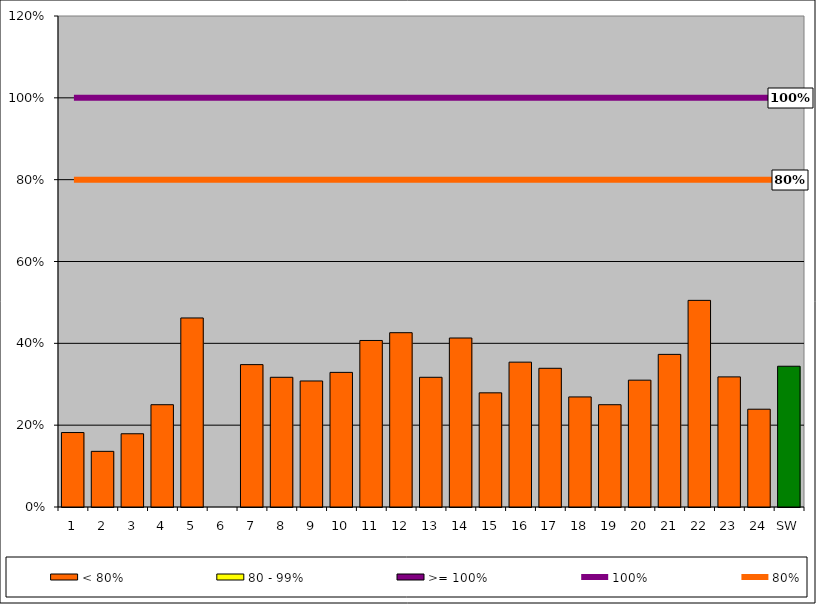
| Category | < 80% | 80 - 99% | >= 100% |
|---|---|---|---|
| 1 | 0.182 | 0 | 0 |
| 2 | 0.136 | 0 | 0 |
| 3 | 0.179 | 0 | 0 |
| 4 | 0.25 | 0 | 0 |
| 5 | 0.462 | 0 | 0 |
| 6 | 0 | 0 | 0 |
| 7 | 0.348 | 0 | 0 |
| 8 | 0.317 | 0 | 0 |
| 9 | 0.308 | 0 | 0 |
| 10 | 0.329 | 0 | 0 |
| 11 | 0.407 | 0 | 0 |
| 12 | 0.426 | 0 | 0 |
| 13 | 0.317 | 0 | 0 |
| 14 | 0.413 | 0 | 0 |
| 15 | 0.279 | 0 | 0 |
| 16 | 0.354 | 0 | 0 |
| 17 | 0.339 | 0 | 0 |
| 18 | 0.269 | 0 | 0 |
| 19 | 0.25 | 0 | 0 |
| 20 | 0.31 | 0 | 0 |
| 21 | 0.373 | 0 | 0 |
| 22 | 0.505 | 0 | 0 |
| 23 | 0.318 | 0 | 0 |
| 24 | 0.239 | 0 | 0 |
| SW | 0.344 | 0 | 0 |